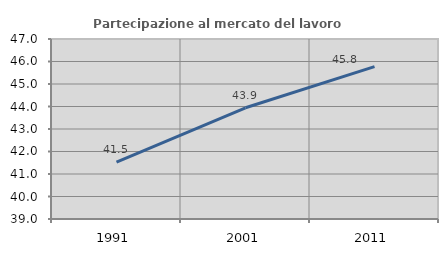
| Category | Partecipazione al mercato del lavoro  femminile |
|---|---|
| 1991.0 | 41.527 |
| 2001.0 | 43.943 |
| 2011.0 | 45.774 |